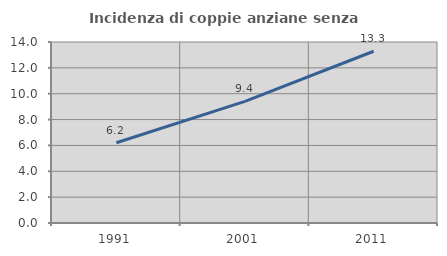
| Category | Incidenza di coppie anziane senza figli  |
|---|---|
| 1991.0 | 6.209 |
| 2001.0 | 9.412 |
| 2011.0 | 13.283 |